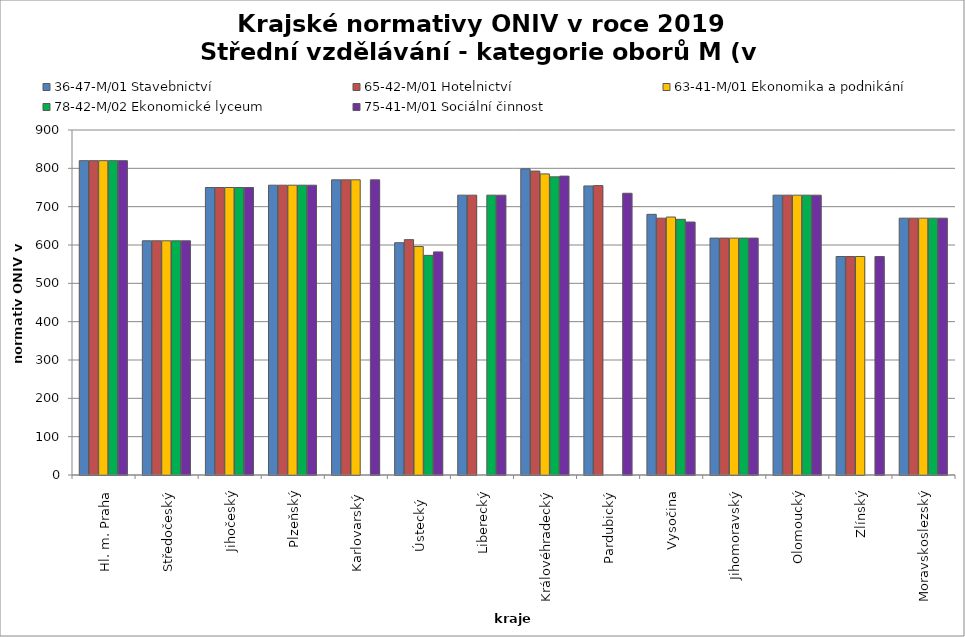
| Category | 36-47-M/01 Stavebnictví | 65-42-M/01 Hotelnictví | 63-41-M/01 Ekonomika a podnikání | 78-42-M/02 Ekonomické lyceum | 75-41-M/01 Sociální činnost |
|---|---|---|---|---|---|
| Hl. m. Praha | 820 | 820 | 820 | 820 | 820 |
| Středočeský | 611 | 611 | 611 | 611 | 611 |
| Jihočeský | 750 | 750 | 750 | 750 | 750 |
| Plzeňský | 756 | 756 | 756 | 756 | 756 |
| Karlovarský  | 770 | 770 | 770 | 0 | 770 |
| Ústecký   | 606 | 614 | 596 | 573 | 582 |
| Liberecký | 730 | 730 | 0 | 730 | 730 |
| Královéhradecký | 798.7 | 792.9 | 785.5 | 777.8 | 779.7 |
| Pardubický | 754 | 755 | 0 | 0 | 735 |
| Vysočina | 680 | 670 | 673 | 667 | 660 |
| Jihomoravský | 618 | 618 | 618 | 618 | 618 |
| Olomoucký | 730 | 730 | 730 | 730 | 730 |
| Zlínský | 570 | 570 | 570 | 0 | 570 |
| Moravskoslezský | 670 | 670 | 670 | 670 | 670 |